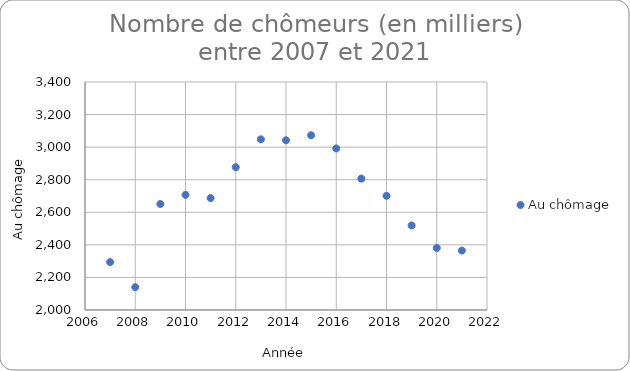
| Category | Au chômage |
|---|---|
| 2007.0 | 2294 |
| 2008.0 | 2140 |
| 2009.0 | 2651 |
| 2010.0 | 2707 |
| 2011.0 | 2687 |
| 2012.0 | 2877 |
| 2013.0 | 3048 |
| 2014.0 | 3042 |
| 2015.0 | 3073 |
| 2016.0 | 2992 |
| 2017.0 | 2807 |
| 2018.0 | 2701 |
| 2019.0 | 2519 |
| 2020.0 | 2381 |
| 2021.0 | 2365 |